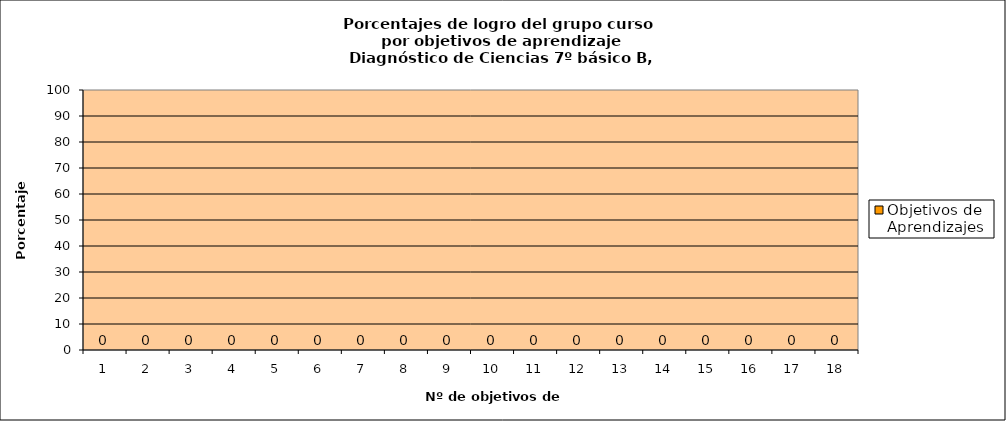
| Category | Objetivos de Aprendizajes |
|---|---|
| 0 | 0 |
| 1 | 0 |
| 2 | 0 |
| 3 | 0 |
| 4 | 0 |
| 5 | 0 |
| 6 | 0 |
| 7 | 0 |
| 8 | 0 |
| 9 | 0 |
| 10 | 0 |
| 11 | 0 |
| 12 | 0 |
| 13 | 0 |
| 14 | 0 |
| 15 | 0 |
| 16 | 0 |
| 17 | 0 |